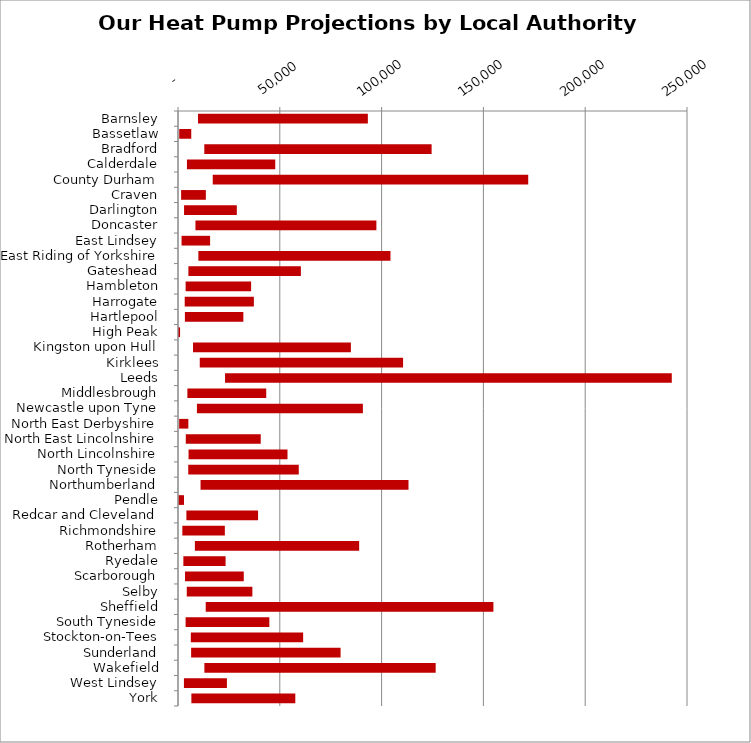
| Category | MIN | MAX |
|---|---|---|
| Barnsley | 9826 | 83420 |
| Bassetlaw | 588 | 5925 |
| Bradford | 12916 | 111645 |
| Calderdale | 4390 | 43381 |
| County Durham | 17060 | 154955 |
| Craven | 1527 | 12151 |
| Darlington | 2974 | 25917 |
| Doncaster | 8566 | 88872 |
| East Lindsey | 1746 | 14020 |
| East Riding of Yorkshire | 9997 | 94364 |
| Gateshead | 5111 | 55243 |
| Hambleton | 3749 | 32164 |
| Harrogate | 3297 | 33969 |
| Hartlepool | 3388 | 28712 |
| High Peak | 109 | 910 |
| Kingston upon Hull | 7374 | 77541 |
| Kirklees | 10684 | 99865 |
| Leeds | 23106 | 219419 |
| Middlesbrough | 4608 | 38730 |
| Newcastle upon Tyne | 9295 | 81512 |
| North East Derbyshire | 565 | 4514 |
| North East Lincolnshire | 3829 | 36808 |
| North Lincolnshire | 5184 | 48600 |
| North Tyneside | 5030 | 54288 |
| Northumberland | 11079 | 102132 |
| Pendle | 251 | 2686 |
| Redcar and Cleveland | 4122 | 35207 |
| Richmondshire | 2130 | 20876 |
| Rotherham | 8297 | 80681 |
| Ryedale | 2634 | 20743 |
| Scarborough | 3447 | 28859 |
| Selby | 4302 | 32229 |
| Sheffield | 13613 | 141305 |
| South Tyneside | 3741 | 41117 |
| Stockton-on-Tees | 6293 | 55172 |
| Sunderland | 6445 | 73405 |
| Wakefield | 12957 | 113603 |
| West Lindsey | 2913 | 21115 |
| York | 6567 | 51051 |